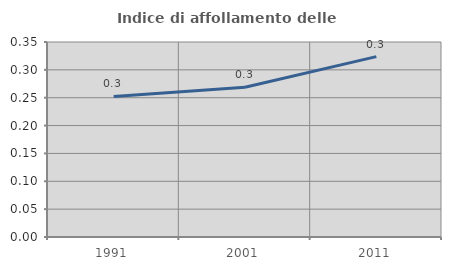
| Category | Indice di affollamento delle abitazioni  |
|---|---|
| 1991.0 | 0.252 |
| 2001.0 | 0.269 |
| 2011.0 | 0.324 |